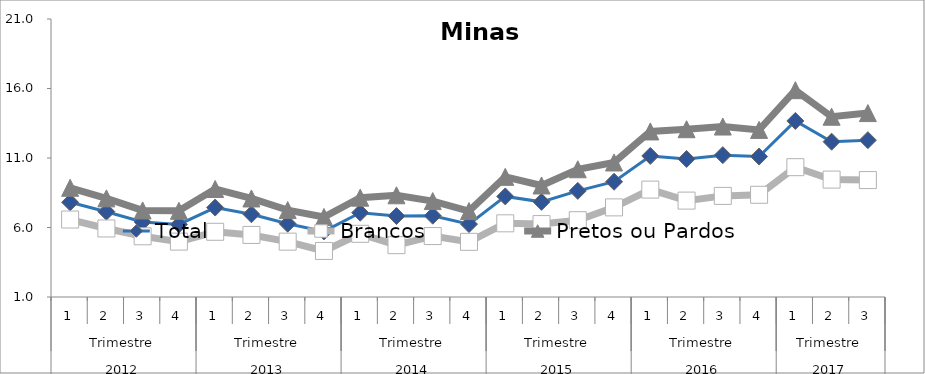
| Category | Total | Brancos | Pretos ou Pardos |
|---|---|---|---|
| 0 | 7.812 | 6.574 | 8.857 |
| 1 | 7.137 | 5.93 | 8.096 |
| 2 | 6.401 | 5.367 | 7.228 |
| 3 | 6.222 | 4.984 | 7.2 |
| 4 | 7.435 | 5.692 | 8.769 |
| 5 | 6.953 | 5.465 | 8.088 |
| 6 | 6.27 | 4.982 | 7.254 |
| 7 | 5.717 | 4.314 | 6.756 |
| 8 | 7.063 | 5.546 | 8.147 |
| 9 | 6.823 | 4.729 | 8.317 |
| 10 | 6.848 | 5.385 | 7.901 |
| 11 | 6.243 | 4.969 | 7.182 |
| 12 | 8.235 | 6.301 | 9.644 |
| 13 | 7.845 | 6.246 | 9.024 |
| 14 | 8.635 | 6.525 | 10.19 |
| 15 | 9.292 | 7.447 | 10.677 |
| 16 | 11.148 | 8.726 | 12.912 |
| 17 | 10.929 | 7.935 | 13.071 |
| 18 | 11.203 | 8.274 | 13.263 |
| 19 | 11.105 | 8.353 | 13.022 |
| 20 | 13.666 | 10.339 | 15.879 |
| 21 | 12.174 | 9.447 | 13.969 |
| 22 | 12.284 | 9.412 | 14.231 |